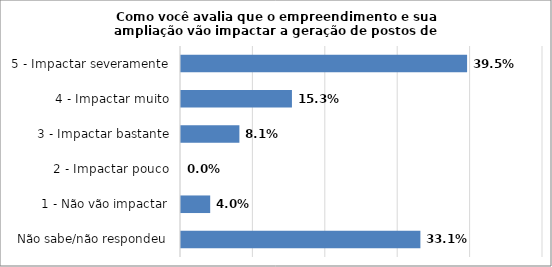
| Category | Series 0 |
|---|---|
| Não sabe/não respondeu | 0.331 |
| 1 - Não vão impactar | 0.04 |
| 2 - Impactar pouco | 0 |
| 3 - Impactar bastante | 0.081 |
| 4 - Impactar muito | 0.153 |
| 5 - Impactar severamente | 0.395 |